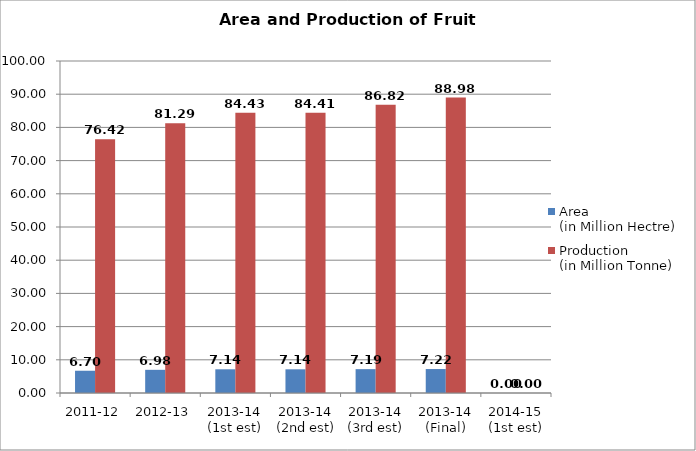
| Category | Area
(in Million Hectre) | Production
(in Million Tonne) |
|---|---|---|
| 2011-12 | 6.705 | 76.424 |
| 2012-13 | 6.982 | 81.285 |
| 2013-14
(1st est) | 7.14 | 84.426 |
| 2013-14
(2nd est) | 7.136 | 84.411 |
| 2013-14
(3rd est) | 7.186 | 86.822 |
| 2013-14
(Final) | 7.216 | 88.977 |
| 2014-15
(1st est) | 0 | 0 |